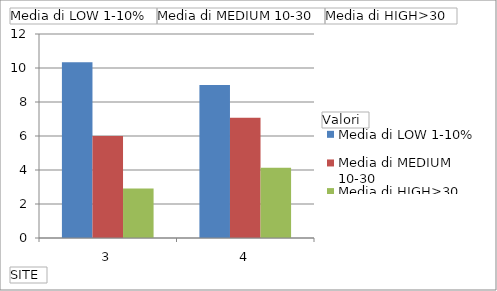
| Category | Media di LOW 1-10% | Media di MEDIUM 10-30 | Media di HIGH>30 |
|---|---|---|---|
| 3 | 10.333 | 6 | 2.905 |
| 4 | 9 | 7.067 | 4.133 |